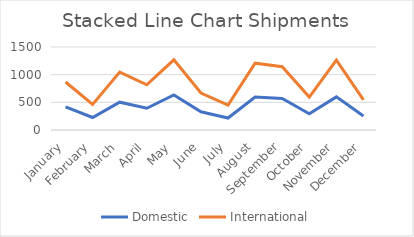
| Category | Domestic | International |
|---|---|---|
| January | 417 | 450 |
| February | 226 | 237 |
| March | 503 | 543 |
| April | 393 | 424 |
| May | 634 | 635 |
| June | 329 | 339 |
| July | 216 | 233 |
| August | 595 | 613 |
| September | 571 | 572 |
| October | 293 | 302 |
| November | 599 | 665 |
| December | 253 | 291 |